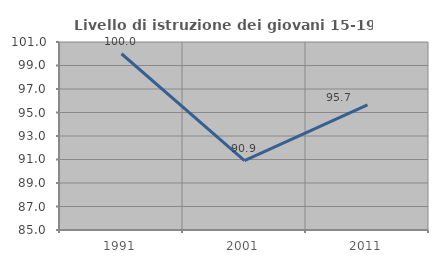
| Category | Livello di istruzione dei giovani 15-19 anni |
|---|---|
| 1991.0 | 100 |
| 2001.0 | 90.909 |
| 2011.0 | 95.652 |